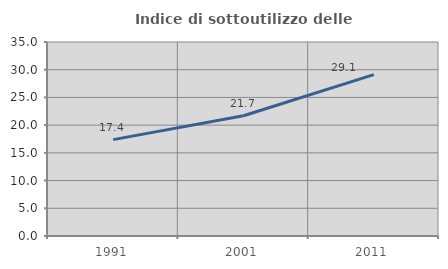
| Category | Indice di sottoutilizzo delle abitazioni  |
|---|---|
| 1991.0 | 17.391 |
| 2001.0 | 21.694 |
| 2011.0 | 29.104 |